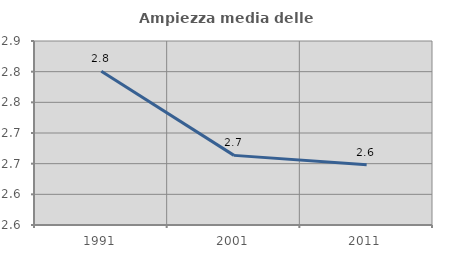
| Category | Ampiezza media delle famiglie |
|---|---|
| 1991.0 | 2.801 |
| 2001.0 | 2.664 |
| 2011.0 | 2.648 |